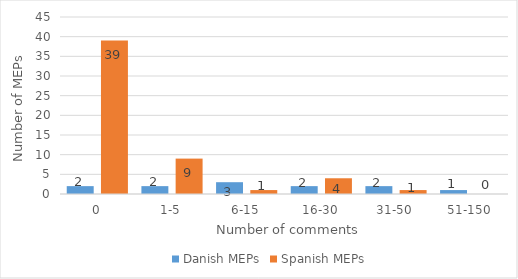
| Category | Danish MEPs | Spanish MEPs |
|---|---|---|
| 0 | 2 | 39 |
| 1-5 | 2 | 9 |
| 6-15 | 3 | 1 |
| 16-30 | 2 | 4 |
| 31-50 | 2 | 1 |
| 51-150 | 1 | 0 |